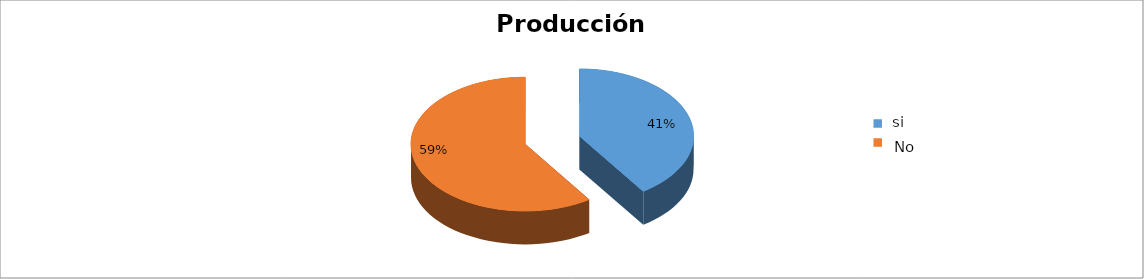
| Category | Series 0 |
|---|---|
| 0 | 0.405 |
| 1 | 0.595 |